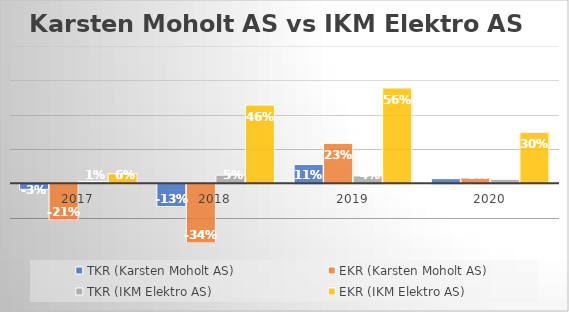
| Category | TKR (Karsten Moholt AS) | EKR (Karsten Moholt AS) | TKR (IKM Elektro AS) | EKR (IKM Elektro AS) |
|---|---|---|---|---|
| 2017.0 | -0.032 | -0.21 | 0.011 | 0.056 |
| 2018.0 | -0.133 | -0.344 | 0.048 | 0.456 |
| 2019.0 | 0.11 | 0.232 | 0.044 | 0.556 |
| 2020.0 | 0.027 | 0.031 | 0.024 | 0.298 |